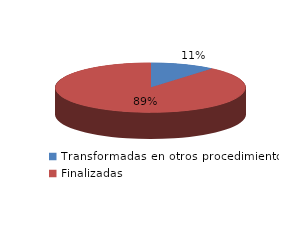
| Category | Series 0 |
|---|---|
| Transformadas en otros procedimientos | 2864 |
| Finalizadas | 23121 |